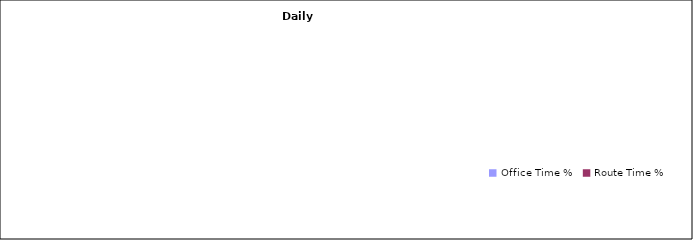
| Category | Series 0 |
|---|---|
| Office Time % | 0 |
| Route Time % | 0 |